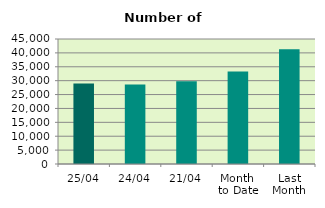
| Category | Series 0 |
|---|---|
| 25/04 | 29016 |
| 24/04 | 28632 |
| 21/04 | 29782 |
| Month 
to Date | 33301.6 |
| Last
Month | 41301.217 |